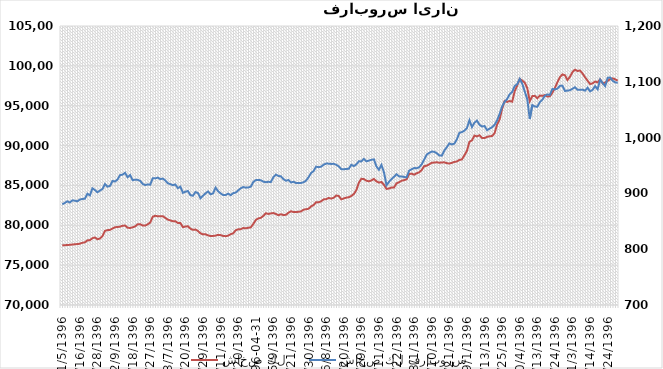
| Category | شاخص كل |
|---|---|
| 1396-01-05 | 77485.8 |
| 1396-01-06 | 77502.9 |
| 1396-01-07 | 77523.3 |
| 1396-01-08 | 77548.5 |
| 1396-01-09 | 77584.4 |
| 1396-01-14 | 77616.8 |
| 1396-01-15 | 77647.1 |
| 1396-01-16 | 77689.9 |
| 1396-01-19 | 77804.7 |
| 1396-01-20 | 77860.4 |
| 1396-01-21 | 78107.8 |
| 1396-01-23 | 78132.4 |
| 1396-01-26 | 78383.3 |
| 1396-01-27 | 78471.7 |
| 1396-01-28 | 78247.5 |
| 1396-01-29 | 78339.8 |
| 1396-01-30 | 78651.4 |
| 1396-02-02 | 79302.7 |
| 1396-02-03 | 79390.6 |
| 1396-02-04 | 79425.9 |
| 1396-02-06 | 79596.9 |
| 1396-02-09 | 79755.6 |
| 1396-02-10 | 79785 |
| 1396-02-11 | 79826.6 |
| 1396-02-12 | 79942.1 |
| 1396-02-13 | 79969.2 |
| 1396-02-16 | 79697.4 |
| 1396-02-17 | 79660.9 |
| 1396-02-18 | 79744.1 |
| 1396-02-19 | 79858.8 |
| 1396-02-20 | 80127.1 |
| 1396-02-23 | 80142 |
| 1396-02-24 | 79963 |
| 1396-02-25 | 79957.5 |
| 1396-02-26 | 80129.3 |
| 1396-02-27 | 80344.2 |
| 1396-02-30 | 81077.6 |
| 1396-02-31 | 81194 |
| 1396-03-01 | 81124.4 |
| 1396-03-02 | 81124.4 |
| 1396-03-03 | 81146.2 |
| 1396-03-06 | 80921.2 |
| 1396-03-07 | 80713.2 |
| 1396-03-08 | 80607.9 |
| 1396-03-09 | 80511.5 |
| 1396-03-10 | 80513.3 |
| 1396-03-13 | 80288.9 |
| 1396-03-16 | 80293.5 |
| 1396-03-17 | 79758.5 |
| 1396-03-20 | 79855.7 |
| 1396-03-21 | 79870.7 |
| 1396-03-22 | 79564.1 |
| 1396-03-23 | 79426.9 |
| 1396-03-24 | 79465.7 |
| 1396-03-27 | 79285 |
| 1396-03-28 | 78990.4 |
| 1396-03-29 | 78859.2 |
| 1396-03-30 | 78867.5 |
| 1396-03-31 | 78736.2 |
| 1396-04-03 | 78652.7 |
| 1396-04-04 | 78665.5 |
| 1396-04-07 | 78704.5 |
| 1396-04-10 | 78799.7 |
| 1396-04-11 | 78765.3 |
| 1396-04-12 | 78659.2 |
| 1396-04-13 | 78632.5 |
| 1396-04-14 | 78700.2 |
| 1396-04-17 | 78881.6 |
| 1396-04-18 | 78985.4 |
| 1396-04-19 | 79377 |
| 1396-04-20 | 79490.4 |
| 1396-04-21 | 79509.6 |
| 1396-04-24 | 79658.9 |
| 1396-04-25 | 79620.8 |
| 1396-04-26 | 79692.9 |
| 1396-04-27 | 79735.7 |
| 1396-04-28 | 80162.5 |
| 1396-04-31 | 80670.8 |
| 1396-05-01 | 80863 |
| 1396-05-02 | 80933.9 |
| 1396-05-03 | 81181.7 |
| 1396-05-04 | 81509.3 |
| 1396-05-07 | 81420.9 |
| 1396-05-08 | 81491.4 |
| 1396-05-09 | 81533.5 |
| 1396-05-10 | 81415.9 |
| 1396-05-11 | 81265.9 |
| 1396-05-15 | 81384.1 |
| 1396-05-16 | 81285.7 |
| 1396-05-17 | 81313.9 |
| 1396-05-18 | 81579.3 |
| 1396-05-21 | 81763.1 |
| 1396-05-22 | 81661.5 |
| 1396-05-23 | 81659.3 |
| 1396-05-24 | 81696.3 |
| 1396-05-25 | 81741.9 |
| 1396-05-28 | 81954.9 |
| 1396-05-29 | 82016.2 |
| 1396-05-30 | 82075 |
| 1396-05-31 | 82372.4 |
| 1396-06-01 | 82541.8 |
| 1396-06-04 | 82897.1 |
| 1396-06-05 | 82885 |
| 1396-06-06 | 83012.1 |
| 1396-06-07 | 83252 |
| 1396-06-08 | 83272.9 |
| 1396-06-11 | 83428.2 |
| 1396-06-12 | 83345.2 |
| 1396-06-13 | 83452.1 |
| 1396-06-14 | 83733.5 |
| 1396-06-15 | 83675.3 |
| 1396-06-19 | 83255.7 |
| 1396-06-20 | 83369.1 |
| 1396-06-21 | 83469.2 |
| 1396-06-22 | 83523.8 |
| 1396-06-25 | 83683.2 |
| 1396-06-26 | 83916.6 |
| 1396-06-27 | 84414.5 |
| 1396-06-28 | 85343.9 |
| 1396-06-29 | 85831.8 |
| 1396-07-01 | 85798.4 |
| 1396-07-02 | 85588.8 |
| 1396-07-03 | 85516.9 |
| 1396-07-04 | 85628.8 |
| 1396-07-05 | 85819 |
| 1396-07-10 | 85514.9 |
| 1396-07-11 | 85355 |
| 1396-07-12 | 85429.5 |
| 1396-07-15 | 85069.5 |
| 1396-07-16 | 84564.9 |
| 1396-07-17 | 84611.6 |
| 1396-07-18 | 84734.4 |
| 1396-07-19 | 84744.1 |
| 1396-07-22 | 85263.6 |
| 1396-07-23 | 85394.9 |
| 1396-07-24 | 85590.7 |
| 1396-07-25 | 85660 |
| 1396-07-26 | 85768 |
| 1396-07-29 | 86430.5 |
| 1396-07-30 | 86480.2 |
| 1396-08-01 | 86346.2 |
| 1396-08-02 | 86529.2 |
| 1396-08-03 | 86636.8 |
| 1396-08-06 | 86935.4 |
| 1396-08-07 | 87416.6 |
| 1396-08-08 | 87477.2 |
| 1396-08-09 | 87649.9 |
| 1396-08-10 | 87844.9 |
| 1396-08-13 | 87868.6 |
| 1396-08-14 | 87905.1 |
| 1396-08-15 | 87843.7 |
| 1396-08-16 | 87883.1 |
| 1396-08-17 | 87897.4 |
| 1396-08-20 | 87795.2 |
| 1396-08-21 | 87744.7 |
| 1396-08-22 | 87832.5 |
| 1396-08-23 | 87949.8 |
| 1396-08-24 | 88005.9 |
| 1396-08-27 | 88202.3 |
| 1396-08-29 | 88261.2 |
| 1396-08-30 | 88774.6 |
| 1396-09-01 | 89339.1 |
| 1396-09-04 | 90469.5 |
| 1396-09-05 | 90655.5 |
| 1396-09-07 | 91255.2 |
| 1396-09-08 | 91152.2 |
| 1396-09-11 | 91296.7 |
| 1396-09-12 | 90951.8 |
| 1396-09-13 | 90936.6 |
| 1396-09-14 | 91092.2 |
| 1396-09-18 | 91160.3 |
| 1396-09-19 | 91198.9 |
| 1396-09-20 | 91552.4 |
| 1396-09-21 | 92628.9 |
| 1396-09-22 | 93283.7 |
| 1396-09-25 | 94606.424 |
| 1396-09-26 | 95600.749 |
| 1396-09-27 | 95477.406 |
| 1396-09-28 | 95590.611 |
| 1396-09-29 | 95508.639 |
| 1396-10-02 | 96816.034 |
| 1396-10-03 | 97529.346 |
| 1396-10-04 | 98358.421 |
| 1396-10-05 | 98152.798 |
| 1396-10-06 | 97899.156 |
| 1396-10-09 | 97211.41 |
| 1396-10-10 | 95561.578 |
| 1396-10-11 | 96207.996 |
| 1396-10-12 | 96241.28 |
| 1396-10-13 | 95929.456 |
| 1396-10-16 | 96270.387 |
| 1396-10-17 | 96234.539 |
| 1396-10-18 | 96332.547 |
| 1396-10-19 | 96149.269 |
| 1396-10-20 | 96185.986 |
| 1396-10-23 | 96627.552 |
| 1396-10-24 | 97228.674 |
| 1396-10-25 | 97944.035 |
| 1396-10-26 | 98596.934 |
| 1396-10-27 | 98923.554 |
| 1396-10-30 | 98817.281 |
| 1396-11-01 | 98221.088 |
| 1396-11-02 | 98628.427 |
| 1396-11-03 | 99224.797 |
| 1396-11-04 | 99522.18 |
| 1396-11-07 | 99355.554 |
| 1396-11-08 | 99414.55 |
| 1396-11-09 | 99046.116 |
| 1396-11-10 | 98557.872 |
| 1396-11-11 | 98133.518 |
| 1396-11-14 | 97718.809 |
| 1396-11-15 | 97808.188 |
| 1396-11-16 | 98033.536 |
| 1396-11-17 | 97927.504 |
| 1396-11-18 | 98299.736 |
| 1396-11-21 | 97782.732 |
| 1396-11-23 | 97924.73 |
| 1396-11-24 | 98103.362 |
| 1396-11-25 | 98347.921 |
| 1396-11-28 | 98429.69 |
| 1396-11-29 | 98311.623 |
| 1396-11-30 | 98148.523 |